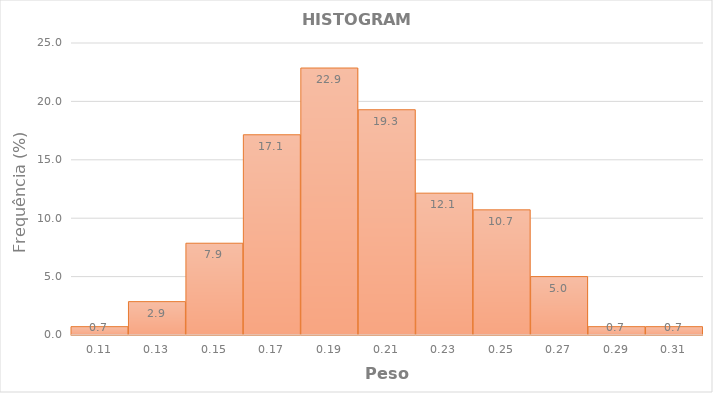
| Category | Frequência (%) |
|---|---|
| 0.11000000000000001 | 0.714 |
| 0.13 | 2.857 |
| 0.15000000000000002 | 7.857 |
| 0.16999999999999998 | 17.143 |
| 0.19 | 22.857 |
| 0.20999999999999996 | 19.286 |
| 0.22999999999999998 | 12.143 |
| 0.24999999999999994 | 10.714 |
| 0.26999999999999996 | 5 |
| 0.29 | 0.714 |
| 0.31 | 0.714 |